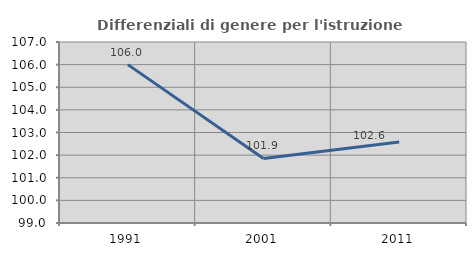
| Category | Differenziali di genere per l'istruzione superiore |
|---|---|
| 1991.0 | 106 |
| 2001.0 | 101.855 |
| 2011.0 | 102.577 |